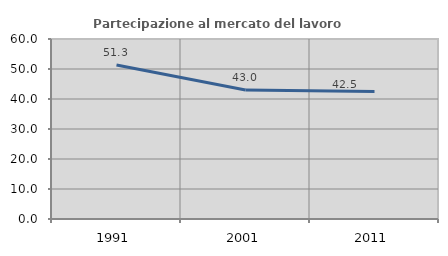
| Category | Partecipazione al mercato del lavoro  femminile |
|---|---|
| 1991.0 | 51.325 |
| 2001.0 | 42.994 |
| 2011.0 | 42.47 |